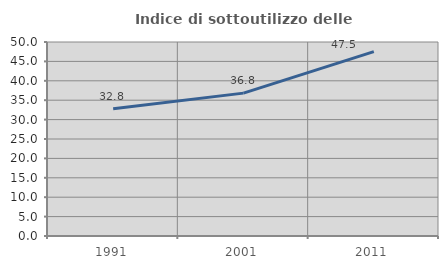
| Category | Indice di sottoutilizzo delle abitazioni  |
|---|---|
| 1991.0 | 32.768 |
| 2001.0 | 36.822 |
| 2011.0 | 47.53 |